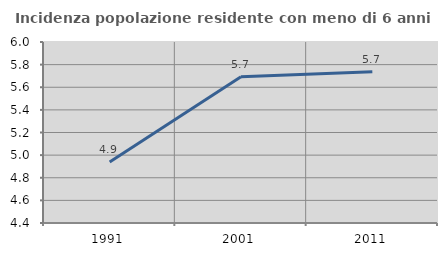
| Category | Incidenza popolazione residente con meno di 6 anni |
|---|---|
| 1991.0 | 4.939 |
| 2001.0 | 5.693 |
| 2011.0 | 5.736 |